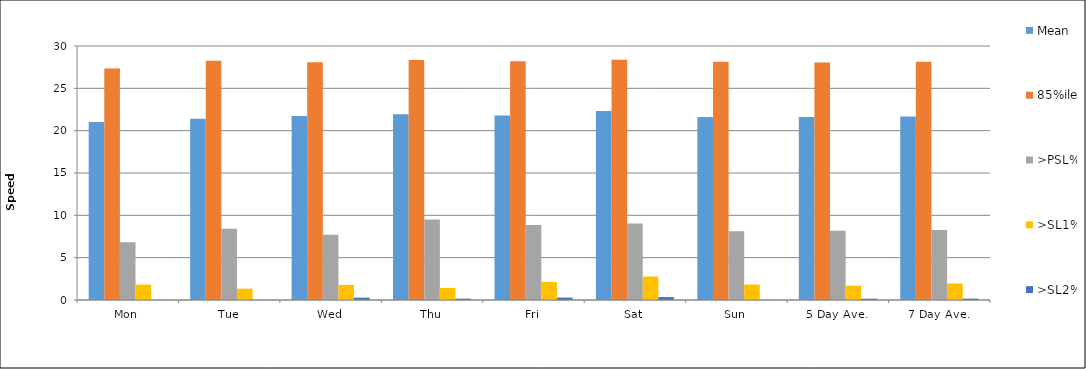
| Category | Mean | 85%ile | >PSL% | >SL1% | >SL2% |
|---|---|---|---|---|---|
| Mon | 21.025 | 27.349 | 6.818 | 1.818 | 0 |
| Tue | 21.415 | 28.26 | 8.413 | 1.338 | 0 |
| Wed | 21.727 | 28.082 | 7.692 | 1.786 | 0.275 |
| Thu | 21.93 | 28.339 | 9.494 | 1.424 | 0.158 |
| Fri | 21.785 | 28.19 | 8.845 | 2.14 | 0.285 |
| Sat | 22.311 | 28.373 | 9.028 | 2.778 | 0.347 |
| Sun | 21.608 | 28.129 | 8.13 | 1.829 | 0 |
| 5 Day Ave. | 21.6 | 28.042 | 8.166 | 1.695 | 0.154 |
| 7 Day Ave. | 21.685 | 28.141 | 8.279 | 1.948 | 0.162 |